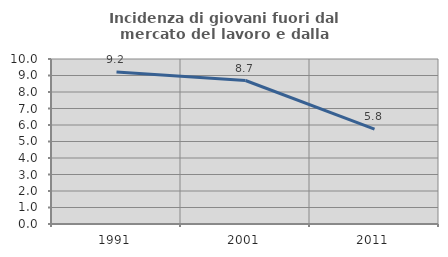
| Category | Incidenza di giovani fuori dal mercato del lavoro e dalla formazione  |
|---|---|
| 1991.0 | 9.206 |
| 2001.0 | 8.696 |
| 2011.0 | 5.752 |